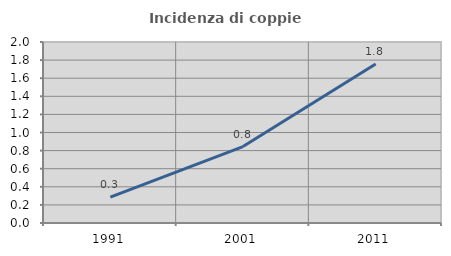
| Category | Incidenza di coppie miste |
|---|---|
| 1991.0 | 0.286 |
| 2001.0 | 0.845 |
| 2011.0 | 1.757 |